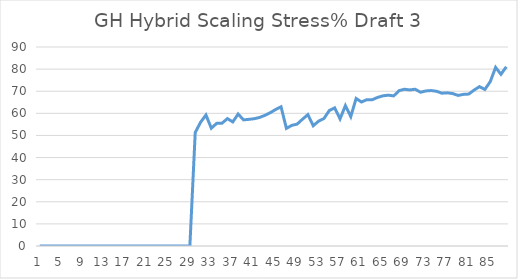
| Category | Series 0 |
|---|---|
| 0 | 0 |
| 1 | 0 |
| 2 | 0 |
| 3 | 0 |
| 4 | 0 |
| 5 | 0 |
| 6 | 0 |
| 7 | 0 |
| 8 | 0 |
| 9 | 0 |
| 10 | 0 |
| 11 | 0 |
| 12 | 0 |
| 13 | 0 |
| 14 | 0 |
| 15 | 0 |
| 16 | 0 |
| 17 | 0 |
| 18 | 0 |
| 19 | 0 |
| 20 | 0 |
| 21 | 0 |
| 22 | 0 |
| 23 | 0 |
| 24 | 0 |
| 25 | 0 |
| 26 | 0 |
| 27 | 0 |
| 28 | 0 |
| 29 | 51.34 |
| 30 | 55.97 |
| 31 | 59.25 |
| 32 | 53.27 |
| 33 | 55.46 |
| 34 | 55.55 |
| 35 | 57.61 |
| 36 | 56.11 |
| 37 | 59.68 |
| 38 | 57.04 |
| 39 | 57.28 |
| 40 | 57.56 |
| 41 | 58.14 |
| 42 | 59.1 |
| 43 | 60.28 |
| 44 | 61.74 |
| 45 | 62.95 |
| 46 | 53.2 |
| 47 | 54.55 |
| 48 | 55.12 |
| 49 | 57.33 |
| 50 | 59.42 |
| 51 | 54.39 |
| 52 | 56.46 |
| 53 | 57.65 |
| 54 | 61.27 |
| 55 | 62.48 |
| 56 | 57.49 |
| 57 | 63.5 |
| 58 | 58.53 |
| 59 | 66.73 |
| 60 | 65.13 |
| 61 | 66.19 |
| 62 | 66.15 |
| 63 | 67.2 |
| 64 | 67.91 |
| 65 | 68.22 |
| 66 | 67.87 |
| 67 | 70.25 |
| 68 | 70.89 |
| 69 | 70.59 |
| 70 | 70.91 |
| 71 | 69.54 |
| 72 | 70.13 |
| 73 | 70.3 |
| 74 | 69.97 |
| 75 | 69.11 |
| 76 | 69.27 |
| 77 | 68.95 |
| 78 | 68.1 |
| 79 | 68.58 |
| 80 | 68.71 |
| 81 | 70.53 |
| 82 | 72.08 |
| 83 | 70.8 |
| 84 | 74.32 |
| 85 | 80.78 |
| 86 | 77.65 |
| 87 | 81.07 |